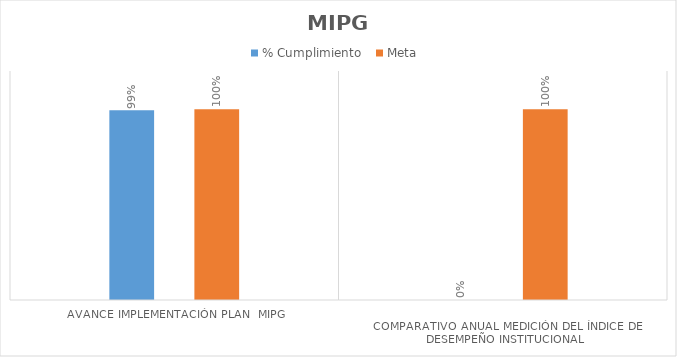
| Category | % Cumplimiento  | Meta  |
|---|---|---|
| Avance implementación plan  MIPG  | 0.995 | 1 |
| 
Comparativo anual medición del Índice de Desempeño Institucional | 0 | 1 |